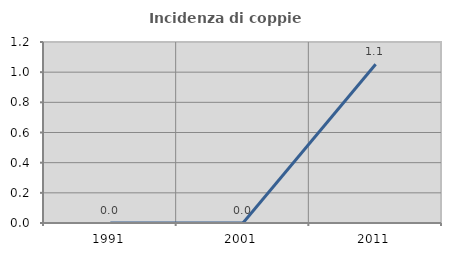
| Category | Incidenza di coppie miste |
|---|---|
| 1991.0 | 0 |
| 2001.0 | 0 |
| 2011.0 | 1.053 |